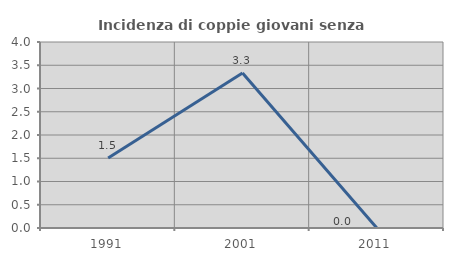
| Category | Incidenza di coppie giovani senza figli |
|---|---|
| 1991.0 | 1.504 |
| 2001.0 | 3.333 |
| 2011.0 | 0 |